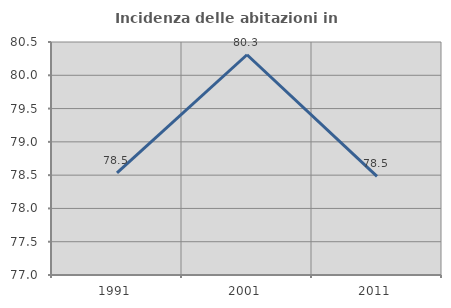
| Category | Incidenza delle abitazioni in proprietà  |
|---|---|
| 1991.0 | 78.533 |
| 2001.0 | 80.308 |
| 2011.0 | 78.481 |